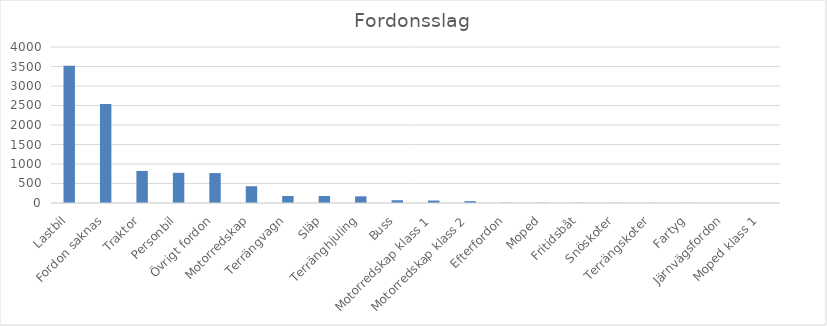
| Category | Summa |
|---|---|
| Lastbil | 3522 |
| Fordon saknas | 2537 |
| Traktor | 822 |
| Personbil | 774 |
| Övrigt fordon | 768 |
| Motorredskap | 430 |
| Terrängvagn | 180 |
| Släp | 180 |
| Terränghjuling | 171 |
| Buss | 71 |
| Motorredskap klass 1 | 63 |
| Motorredskap klass 2 | 48 |
| Efterfordon | 7 |
| Moped | 6 |
| Fritidsbåt | 5 |
| Snöskoter | 4 |
| Terrängskoter | 3 |
| Fartyg | 2 |
| Järnvägsfordon | 1 |
| Moped klass 1 | 1 |